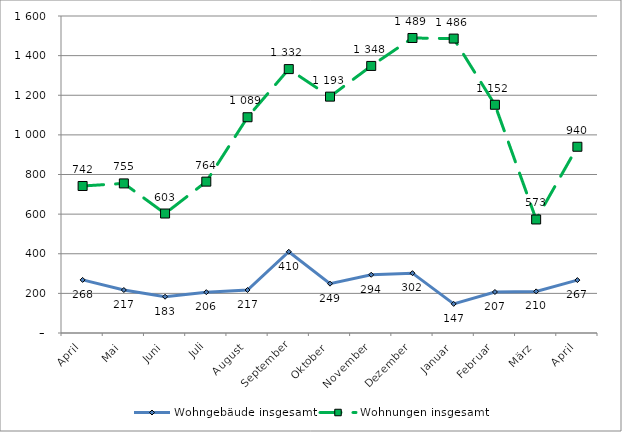
| Category | Wohngebäude insgesamt | Wohnungen insgesamt |
|---|---|---|
| April | 268 | 742 |
| Mai | 217 | 755 |
| Juni | 183 | 603 |
| Juli | 206 | 764 |
| August | 217 | 1089 |
| September | 410 | 1332 |
| Oktober | 249 | 1193 |
| November | 294 | 1348 |
| Dezember | 302 | 1489 |
| Januar | 147 | 1486 |
| Februar | 207 | 1152 |
| März | 210 | 573 |
| April | 267 | 940 |